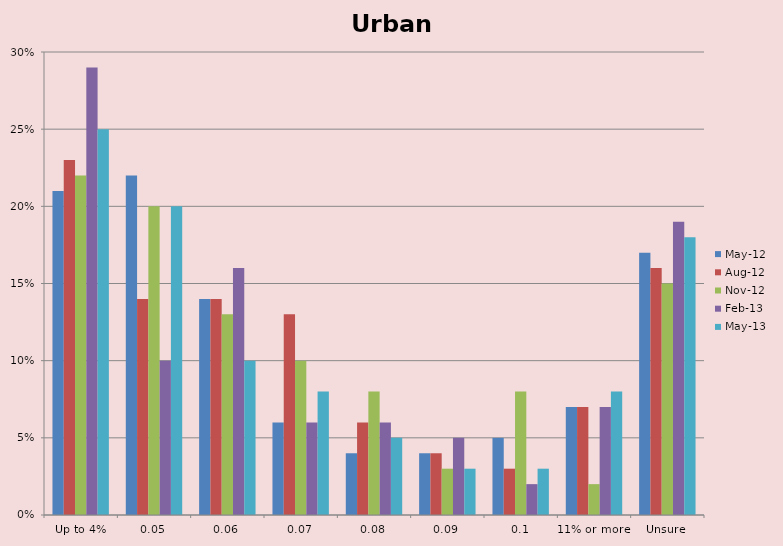
| Category | May-12 | Aug-12 | Nov-12 | Feb-13 | May-13 |
|---|---|---|---|---|---|
| Up to 4% | 0.21 | 0.23 | 0.22 | 0.29 | 0.25 |
| 5% | 0.22 | 0.14 | 0.2 | 0.1 | 0.2 |
| 6% | 0.14 | 0.14 | 0.13 | 0.16 | 0.1 |
| 7% | 0.06 | 0.13 | 0.1 | 0.06 | 0.08 |
| 8% | 0.04 | 0.06 | 0.08 | 0.06 | 0.05 |
| 9% | 0.04 | 0.04 | 0.03 | 0.05 | 0.03 |
| 10% | 0.05 | 0.03 | 0.08 | 0.02 | 0.03 |
| 11% or more | 0.07 | 0.07 | 0.02 | 0.07 | 0.08 |
| Unsure | 0.17 | 0.16 | 0.15 | 0.19 | 0.18 |